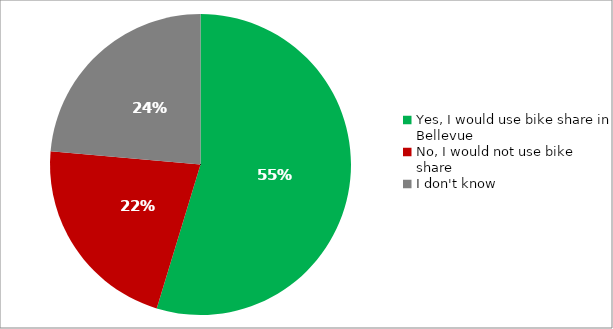
| Category | Responses |
|---|---|
| Yes, I would use bike share in Bellevue | 0.547 |
| No, I would not use bike share | 0.217 |
| I don't know | 0.236 |